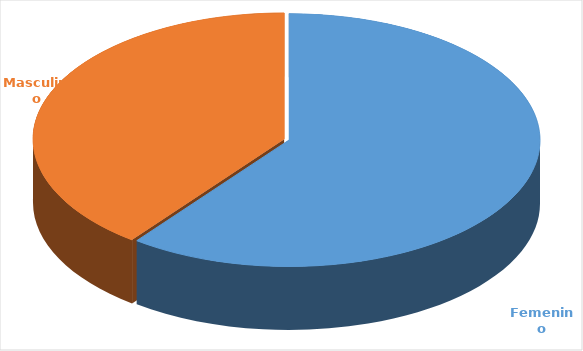
| Category | Cantidad  |
|---|---|
| Femenino | 3664 |
| Masculino | 2407 |